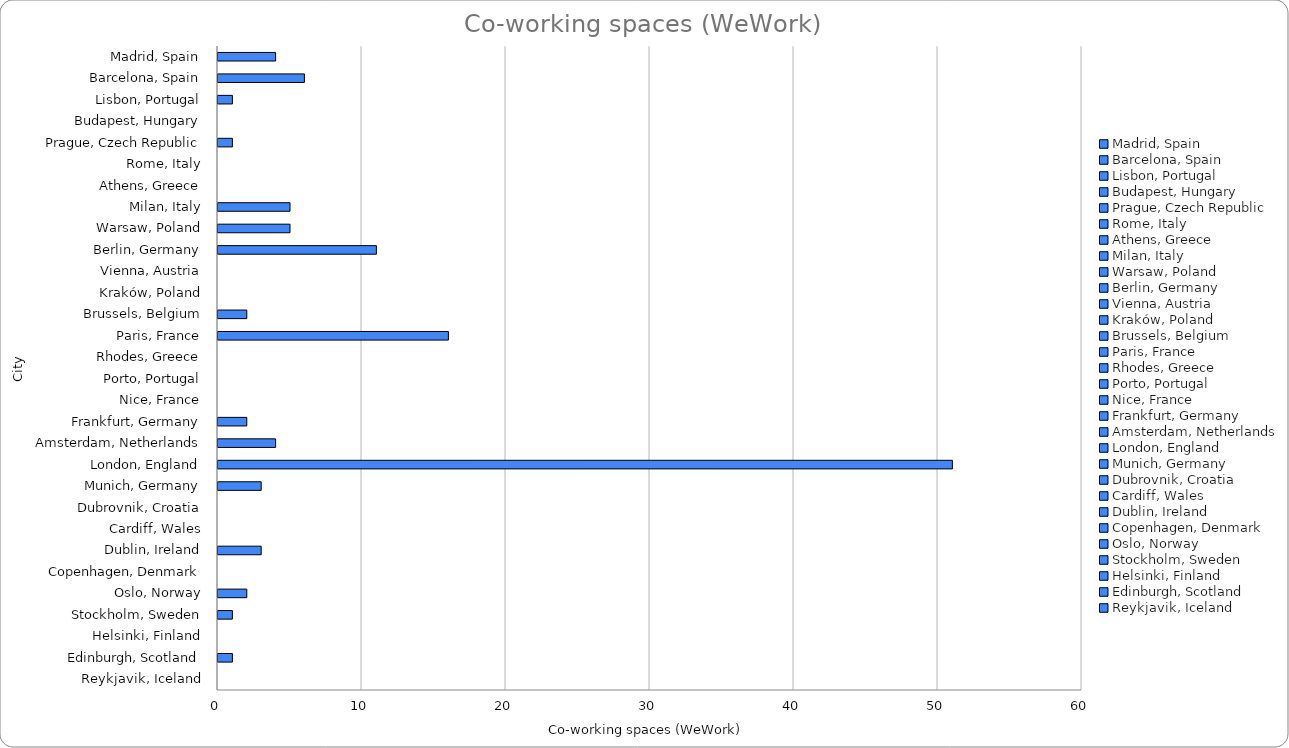
| Category | Co-working spaces (WeWork) |
|---|---|
| Madrid, Spain | 4 |
| Barcelona, Spain | 6 |
| Lisbon, Portugal | 1 |
| Budapest, Hungary | 0 |
| Prague, Czech Republic | 1 |
| Rome, Italy | 0 |
| Athens, Greece | 0 |
| Milan, Italy | 5 |
| Warsaw, Poland | 5 |
| Berlin, Germany | 11 |
| Vienna, Austria | 0 |
| Kraków, Poland | 0 |
| Brussels, Belgium | 2 |
| Paris, France | 16 |
| Rhodes, Greece | 0 |
| Porto, Portugal | 0 |
| Nice, France | 0 |
| Frankfurt, Germany | 2 |
| Amsterdam, Netherlands | 4 |
| London, England | 51 |
| Munich, Germany | 3 |
| Dubrovnik, Croatia | 0 |
| Cardiff, Wales | 0 |
| Dublin, Ireland | 3 |
| Copenhagen, Denmark | 0 |
| Oslo, Norway | 2 |
| Stockholm, Sweden | 1 |
| Helsinki, Finland | 0 |
| Edinburgh, Scotland | 1 |
| Reykjavik, Iceland | 0 |